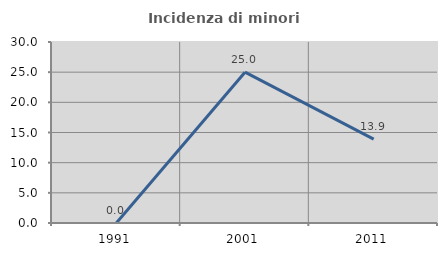
| Category | Incidenza di minori stranieri |
|---|---|
| 1991.0 | 0 |
| 2001.0 | 25 |
| 2011.0 | 13.889 |